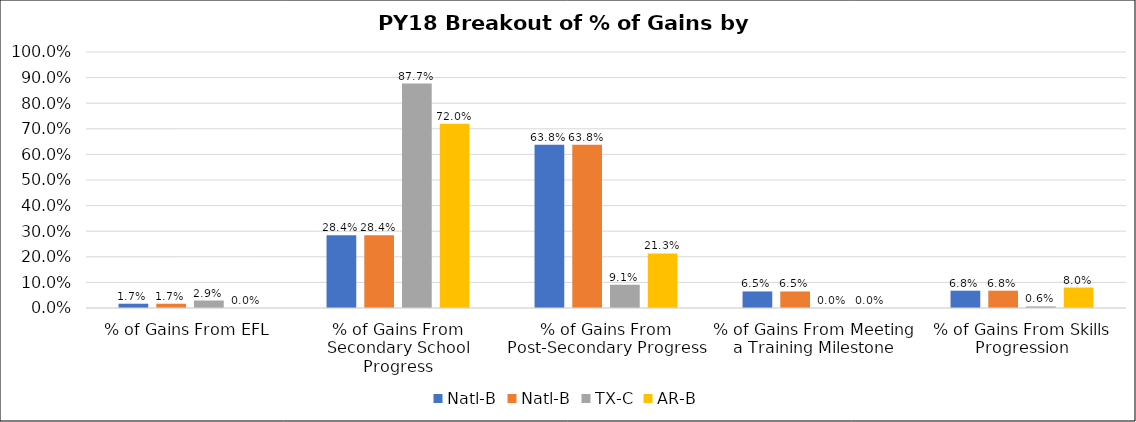
| Category | Natl-B | TX-C | AR-B |
|---|---|---|---|
| % of Gains From EFL | 0.017 | 0.029 | 0 |
| % of Gains From Secondary School Progress | 0.284 | 0.877 | 0.72 |
| % of Gains From Post-Secondary Progress | 0.638 | 0.091 | 0.213 |
| % of Gains From Meeting a Training Milestone | 0.065 | 0 | 0 |
| % of Gains From Skills Progression | 0.068 | 0.006 | 0.08 |